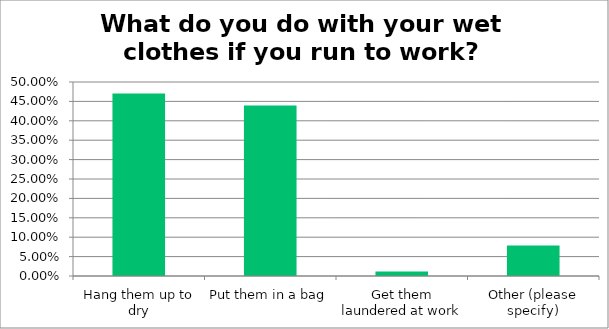
| Category | Responses |
|---|---|
| Hang them up to dry | 0.471 |
| Put them in a bag | 0.439 |
| Get them laundered at work | 0.012 |
| Other (please specify) | 0.078 |